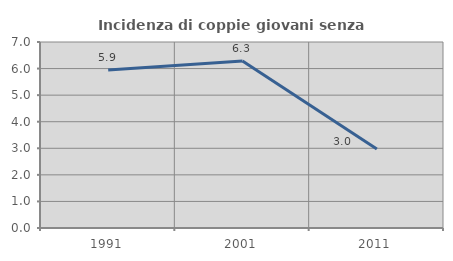
| Category | Incidenza di coppie giovani senza figli |
|---|---|
| 1991.0 | 5.946 |
| 2001.0 | 6.286 |
| 2011.0 | 2.976 |